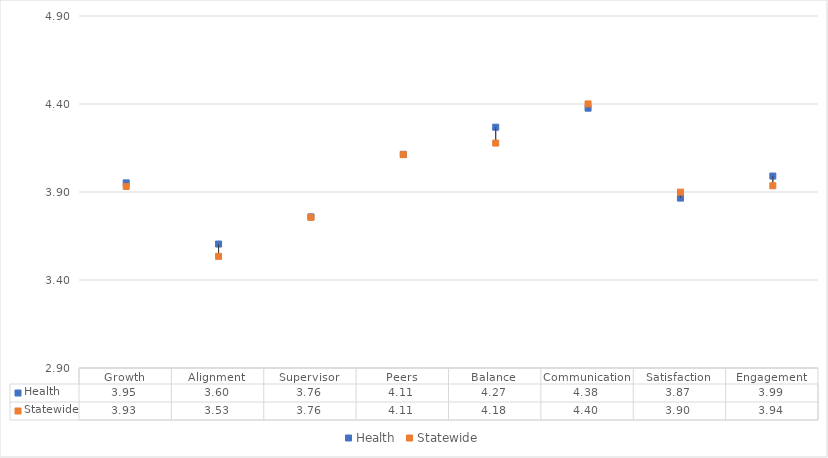
| Category | Health | Statewide |
|---|---|---|
| Growth | 3.952 | 3.931 |
| Alignment | 3.604 | 3.534 |
| Supervisor | 3.759 | 3.756 |
| Peers | 4.114 | 4.112 |
| Balance | 4.268 | 4.178 |
| Communication | 4.376 | 4.4 |
| Satisfaction | 3.865 | 3.899 |
| Engagement | 3.991 | 3.936 |